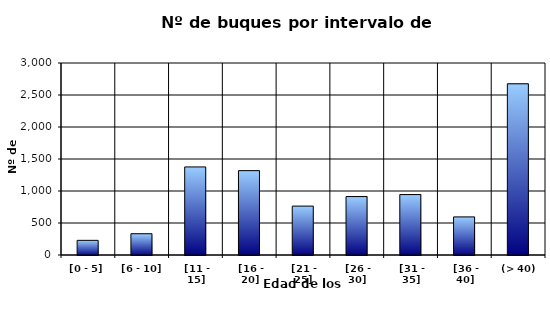
| Category | [0 - 5] |
|---|---|
| [0 - 5] | 229 |
|  [6 - 10] | 332 |
|  [11 - 15] | 1376 |
|  [16 - 20] | 1318 |
|  [21 - 25] | 764 |
|  [26 - 30] | 913 |
|  [31 - 35] | 944 |
|  [36 - 40] | 595 |
|  (> 40) | 2675 |